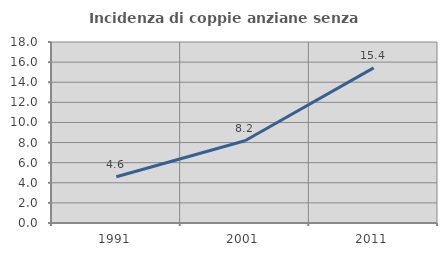
| Category | Incidenza di coppie anziane senza figli  |
|---|---|
| 1991.0 | 4.598 |
| 2001.0 | 8.173 |
| 2011.0 | 15.423 |